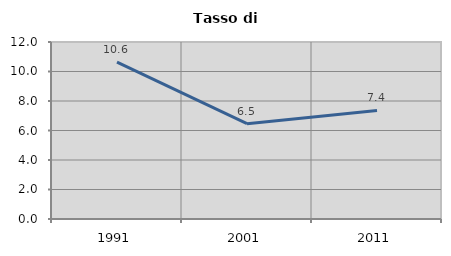
| Category | Tasso di disoccupazione   |
|---|---|
| 1991.0 | 10.634 |
| 2001.0 | 6.461 |
| 2011.0 | 7.363 |